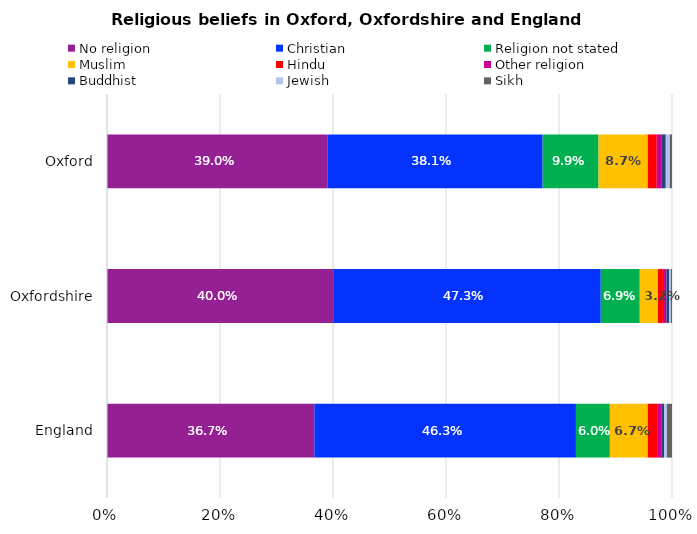
| Category | No religion | Christian | Religion not stated | Muslim | Hindu | Other religion | Buddhist | Jewish | Sikh |
|---|---|---|---|---|---|---|---|---|---|
| Oxford | 0.39 | 0.381 | 0.099 | 0.087 | 0.016 | 0.009 | 0.007 | 0.007 | 0.004 |
| Oxfordshire | 0.4 | 0.473 | 0.069 | 0.032 | 0.009 | 0.006 | 0.005 | 0.003 | 0.002 |
| England | 0.367 | 0.463 | 0.06 | 0.067 | 0.018 | 0.006 | 0.005 | 0.005 | 0.009 |